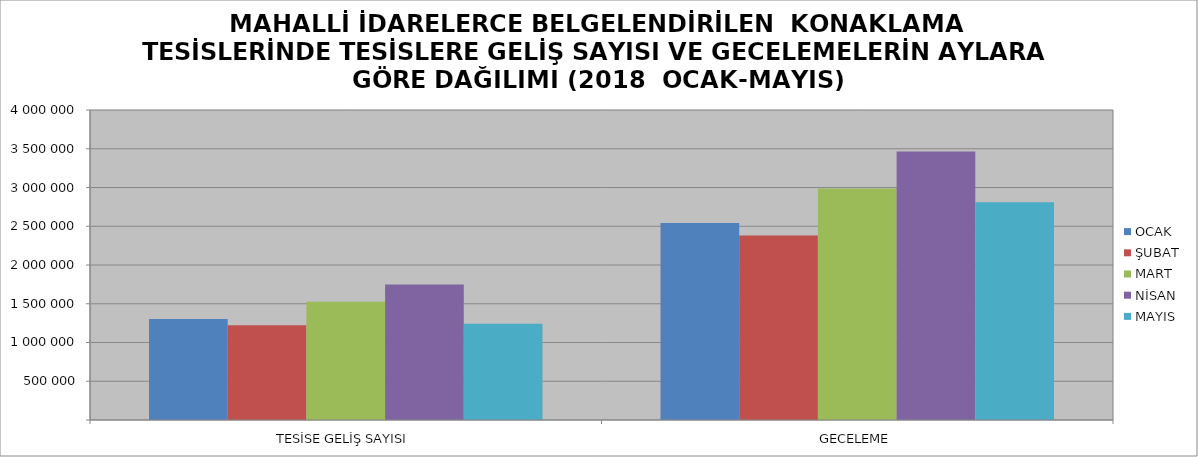
| Category | OCAK | ŞUBAT | MART | NİSAN | MAYIS |
|---|---|---|---|---|---|
| TESİSE GELİŞ SAYISI | 1303353 | 1223475 | 1526172 | 1749085 | 1240889 |
| GECELEME | 2542103 | 2381300 | 2986820 | 3463261 | 2810808 |